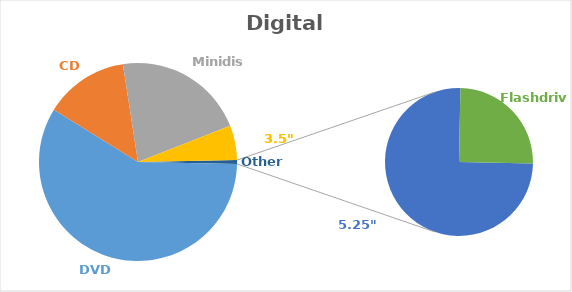
| Category | Series 0 |
|---|---|
| DVD | 384 |
| CD | 90 |
| Minidisc | 141 |
| 3.5" Floppy | 37 |
| 5.25" Floppy | 3 |
| Flashdrive | 1 |